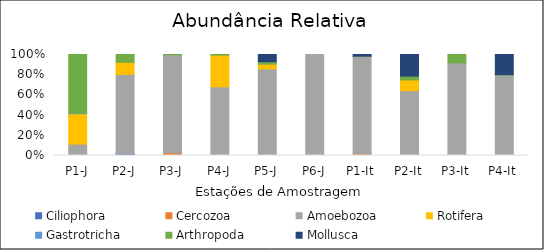
| Category | Ciliophora | Cercozoa | Amoebozoa | Rotifera | Gastrotricha | Arthropoda | Mollusca |
|---|---|---|---|---|---|---|---|
| P1-J | 0 | 0.511 | 10.725 | 30.133 | 0.511 | 58.121 | 0 |
| P2-J | 2.007 | 0 | 78.276 | 12.043 | 0 | 7.674 | 0 |
| P3-J | 0 | 2.769 | 96.906 | 0 | 0 | 0.326 | 0 |
| P4-J | 0 | 0 | 68 | 31.385 | 0 | 0.615 | 0 |
| P5-J | 0 | 0 | 85.714 | 4.762 | 0 | 2.381 | 7.143 |
| P6-J | 0 | 0 | 100 | 0 | 0 | 0 | 0 |
| P1-It | 0 | 1.638 | 96.658 | 0 | 0 | 0.066 | 1.638 |
| P2-It | 0 | 0 | 64.151 | 10.692 | 0 | 3.774 | 21.384 |
| P3-It | 0 | 0 | 91.667 | 0 | 0 | 8.333 | 0 |
| P4-It | 0 | 0 | 79.532 | 0 | 0 | 0.585 | 19.883 |